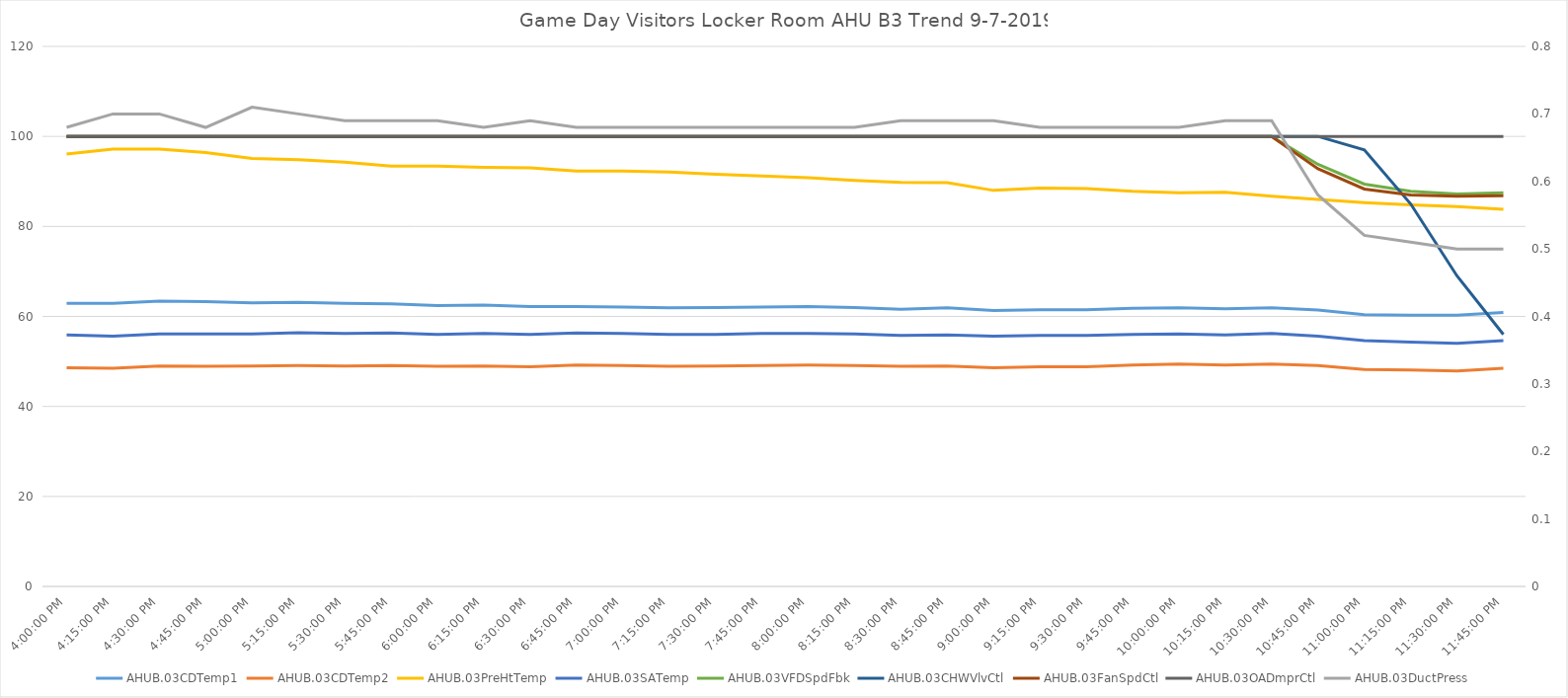
| Category | AHUB.03CDTemp1 | AHUB.03CDTemp2 | AHUB.03PreHtTemp | AHUB.03SATemp | AHUB.03VFDSpdFbk | AHUB.03CHWVlvCtl | AHUB.03FanSpdCtl | AHUB.03OADmprCtl |
|---|---|---|---|---|---|---|---|---|
| 2019-09-07 16:00:00 | 62.9 | 48.6 | 96.1 | 55.9 | 100 | 100 | 100 | 100 |
| 2019-09-07 16:15:00 | 62.9 | 48.5 | 97.2 | 55.6 | 100 | 100 | 100 | 100 |
| 2019-09-07 16:30:00 | 63.4 | 49 | 97.2 | 56.1 | 100 | 100 | 100 | 100 |
| 2019-09-07 16:45:00 | 63.3 | 48.9 | 96.4 | 56.1 | 100 | 100 | 100 | 100 |
| 2019-09-07 17:00:00 | 63 | 49 | 95.1 | 56.1 | 100 | 100 | 100 | 100 |
| 2019-09-07 17:15:00 | 63.1 | 49.1 | 94.8 | 56.4 | 100 | 100 | 100 | 100 |
| 2019-09-07 17:30:00 | 62.9 | 49 | 94.3 | 56.2 | 100 | 100 | 100 | 100 |
| 2019-09-07 17:45:00 | 62.8 | 49.1 | 93.4 | 56.3 | 100 | 100 | 100 | 100 |
| 2019-09-07 18:00:00 | 62.4 | 48.9 | 93.4 | 56 | 100 | 100 | 100 | 100 |
| 2019-09-07 18:15:00 | 62.5 | 49 | 93.1 | 56.2 | 100 | 100 | 100 | 100 |
| 2019-09-07 18:30:00 | 62.2 | 48.8 | 93 | 56 | 100 | 100 | 100 | 100 |
| 2019-09-07 18:45:00 | 62.2 | 49.2 | 92.3 | 56.3 | 100 | 100 | 100 | 100 |
| 2019-09-07 19:00:00 | 62.1 | 49.1 | 92.3 | 56.2 | 100 | 100 | 100 | 100 |
| 2019-09-07 19:15:00 | 61.9 | 48.9 | 92.1 | 56 | 100 | 100 | 100 | 100 |
| 2019-09-07 19:30:00 | 62 | 49 | 91.6 | 56 | 100 | 100 | 100 | 100 |
| 2019-09-07 19:45:00 | 62.1 | 49.1 | 91.2 | 56.2 | 100 | 100 | 100 | 100 |
| 2019-09-07 20:00:00 | 62.2 | 49.2 | 90.8 | 56.2 | 100 | 100 | 100 | 100 |
| 2019-09-07 20:15:00 | 62 | 49.1 | 90.2 | 56.1 | 100 | 100 | 100 | 100 |
| 2019-09-07 20:30:00 | 61.6 | 48.9 | 89.8 | 55.8 | 100 | 100 | 100 | 100 |
| 2019-09-07 20:45:00 | 61.9 | 49 | 89.7 | 55.9 | 100 | 100 | 100 | 100 |
| 2019-09-07 21:00:00 | 61.3 | 48.6 | 88 | 55.6 | 100 | 100 | 100 | 100 |
| 2019-09-07 21:15:00 | 61.5 | 48.8 | 88.5 | 55.8 | 100 | 100 | 100 | 100 |
| 2019-09-07 21:30:00 | 61.5 | 48.8 | 88.4 | 55.8 | 100 | 100 | 100 | 100 |
| 2019-09-07 21:45:00 | 61.8 | 49.2 | 87.8 | 56 | 100 | 100 | 100 | 100 |
| 2019-09-07 22:00:00 | 61.9 | 49.4 | 87.5 | 56.1 | 100 | 100 | 100 | 100 |
| 2019-09-07 22:15:00 | 61.7 | 49.2 | 87.6 | 55.9 | 100 | 100 | 100 | 100 |
| 2019-09-07 22:30:00 | 61.9 | 49.4 | 86.7 | 56.2 | 100 | 100 | 100 | 100 |
| 2019-09-07 22:45:00 | 61.4 | 49.1 | 86 | 55.6 | 93.8 | 100 | 92.8 | 100 |
| 2019-09-07 23:00:00 | 60.4 | 48.2 | 85.3 | 54.6 | 89.4 | 97 | 88.3 | 100 |
| 2019-09-07 23:15:00 | 60.3 | 48.1 | 84.8 | 54.3 | 87.8 | 85 | 87 | 100 |
| 2019-09-07 23:30:00 | 60.3 | 47.9 | 84.4 | 54 | 87.2 | 69 | 86.7 | 100 |
| 2019-09-07 23:45:00 | 60.9 | 48.5 | 83.8 | 54.6 | 87.5 | 56 | 86.8 | 100 |